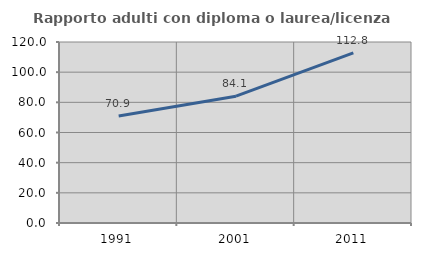
| Category | Rapporto adulti con diploma o laurea/licenza media  |
|---|---|
| 1991.0 | 70.938 |
| 2001.0 | 84.055 |
| 2011.0 | 112.848 |